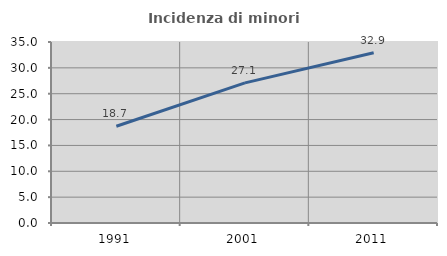
| Category | Incidenza di minori stranieri |
|---|---|
| 1991.0 | 18.71 |
| 2001.0 | 27.097 |
| 2011.0 | 32.937 |